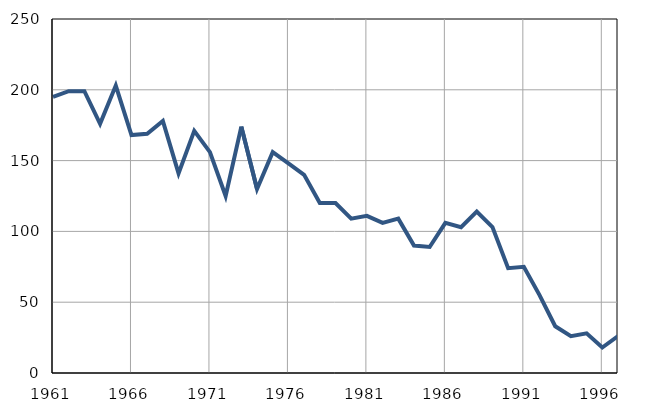
| Category | Infants
deaths |
|---|---|
| 1961.0 | 195 |
| 1962.0 | 199 |
| 1963.0 | 199 |
| 1964.0 | 176 |
| 1965.0 | 203 |
| 1966.0 | 168 |
| 1967.0 | 169 |
| 1968.0 | 178 |
| 1969.0 | 141 |
| 1970.0 | 171 |
| 1971.0 | 156 |
| 1972.0 | 125 |
| 1973.0 | 174 |
| 1974.0 | 130 |
| 1975.0 | 156 |
| 1976.0 | 148 |
| 1977.0 | 140 |
| 1978.0 | 120 |
| 1979.0 | 120 |
| 1980.0 | 109 |
| 1981.0 | 111 |
| 1982.0 | 106 |
| 1983.0 | 109 |
| 1984.0 | 90 |
| 1985.0 | 89 |
| 1986.0 | 106 |
| 1987.0 | 103 |
| 1988.0 | 114 |
| 1989.0 | 103 |
| 1990.0 | 74 |
| 1991.0 | 75 |
| 1992.0 | 55 |
| 1993.0 | 33 |
| 1994.0 | 26 |
| 1995.0 | 28 |
| 1996.0 | 18 |
| 1997.0 | 26 |